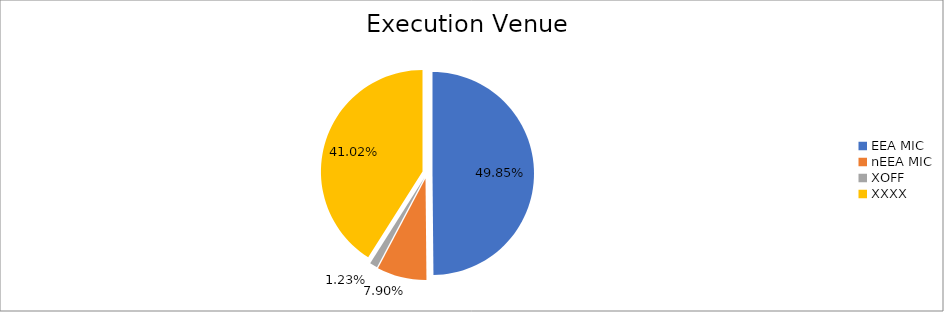
| Category | Series 0 |
|---|---|
| EEA MIC | 6562824.616 |
| nEEA MIC | 1040121.067 |
| XOFF | 162336.999 |
| XXXX | 5399759.905 |